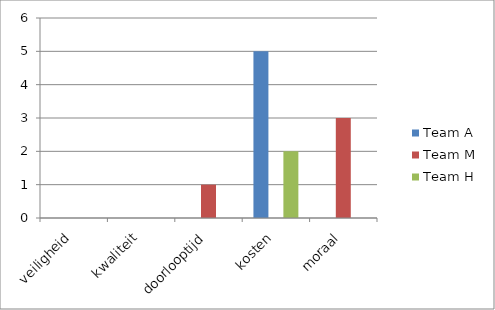
| Category | Team A | Team M | Team H |
|---|---|---|---|
| veiligheid | 0 | 0 | 0 |
| kwaliteit | 0 | 0 | 0 |
| doorlooptijd | 0 | 1 | 0 |
| kosten | 5 | 0 | 2 |
| moraal | 0 | 3 | 0 |